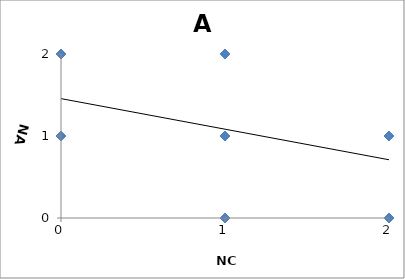
| Category | A |
|---|---|
| 2.0 | 0 |
| 1.0 | 0 |
| 1.0 | 1 |
| 2.0 | 1 |
| 2.0 | 1 |
| 1.0 | 2 |
| 2.0 | 1 |
| 1.0 | 1 |
| 1.0 | 1 |
| 2.0 | 1 |
| 2.0 | 0 |
| 2.0 | 1 |
| 2.0 | 1 |
| 0.0 | 2 |
| 1.0 | 2 |
| 1.0 | 1 |
| 2.0 | 1 |
| 2.0 | 0 |
| 0.0 | 2 |
| 2.0 | 0 |
| 1.0 | 0 |
| 1.0 | 0 |
| 2.0 | 1 |
| 2.0 | 0 |
| 2.0 | 1 |
| 2.0 | 1 |
| 2.0 | 1 |
| 2.0 | 1 |
| 2.0 | 1 |
| 1.0 | 1 |
| 1.0 | 1 |
| 2.0 | 1 |
| 2.0 | 1 |
| 2.0 | 1 |
| 2.0 | 1 |
| 1.0 | 1 |
| 2.0 | 1 |
| 1.0 | 1 |
| 2.0 | 1 |
| 1.0 | 2 |
| 2.0 | 1 |
| 1.0 | 2 |
| 1.0 | 0 |
| 0.0 | 2 |
| 1.0 | 1 |
| 2.0 | 1 |
| 2.0 | 0 |
| 2.0 | 1 |
| 1.0 | 2 |
| 2.0 | 1 |
| 0.0 | 2 |
| 1.0 | 1 |
| 2.0 | 1 |
| 2.0 | 1 |
| 2.0 | 0 |
| 1.0 | 0 |
| 1.0 | 0 |
| 1.0 | 1 |
| 2.0 | 0 |
| 2.0 | 1 |
| 1.0 | 2 |
| 2.0 | 0 |
| 1.0 | 1 |
| 1.0 | 1 |
| 1.0 | 2 |
| 2.0 | 0 |
| 1.0 | 1 |
| 2.0 | 1 |
| 1.0 | 1 |
| 1.0 | 1 |
| 2.0 | 1 |
| 2.0 | 1 |
| 2.0 | 1 |
| 2.0 | 1 |
| 2.0 | 1 |
| 1.0 | 1 |
| 1.0 | 0 |
| 0.0 | 2 |
| 1.0 | 1 |
| 2.0 | 1 |
| 1.0 | 1 |
| 1.0 | 1 |
| 2.0 | 1 |
| 1.0 | 0 |
| 2.0 | 0 |
| 2.0 | 1 |
| 2.0 | 0 |
| 1.0 | 1 |
| 1.0 | 1 |
| 0.0 | 2 |
| 1.0 | 1 |
| 2.0 | 1 |
| 1.0 | 0 |
| 1.0 | 1 |
| 2.0 | 1 |
| 2.0 | 1 |
| 2.0 | 1 |
| 2.0 | 1 |
| 0.0 | 1 |
| 1.0 | 1 |
| 1.0 | 1 |
| 0.0 | 2 |
| 0.0 | 1 |
| 2.0 | 0 |
| 2.0 | 1 |
| 2.0 | 0 |
| 1.0 | 2 |
| 1.0 | 1 |
| 2.0 | 1 |
| 0.0 | 2 |
| 0.0 | 2 |
| 2.0 | 0 |
| 1.0 | 1 |
| 1.0 | 1 |
| 2.0 | 1 |
| 2.0 | 0 |
| 1.0 | 1 |
| 1.0 | 1 |
| 1.0 | 1 |
| 0.0 | 2 |
| 2.0 | 1 |
| 1.0 | 1 |
| 2.0 | 0 |
| 1.0 | 1 |
| 1.0 | 2 |
| 2.0 | 1 |
| 0.0 | 2 |
| 2.0 | 0 |
| 1.0 | 1 |
| 2.0 | 0 |
| 2.0 | 1 |
| 1.0 | 1 |
| 1.0 | 1 |
| 1.0 | 1 |
| 2.0 | 1 |
| 1.0 | 1 |
| 2.0 | 1 |
| 2.0 | 1 |
| 2.0 | 1 |
| 2.0 | 0 |
| 1.0 | 1 |
| 2.0 | 1 |
| 0.0 | 1 |
| 1.0 | 1 |
| 0.0 | 2 |
| 2.0 | 1 |
| 1.0 | 1 |
| 2.0 | 1 |
| 0.0 | 2 |
| 2.0 | 1 |
| 2.0 | 1 |
| 2.0 | 1 |
| 1.0 | 1 |
| 1.0 | 1 |
| 1.0 | 2 |
| 2.0 | 1 |
| 0.0 | 2 |
| 1.0 | 1 |
| 2.0 | 1 |
| 2.0 | 0 |
| 2.0 | 0 |
| 2.0 | 0 |
| 2.0 | 0 |
| 2.0 | 0 |
| 1.0 | 2 |
| 1.0 | 1 |
| 1.0 | 2 |
| 2.0 | 1 |
| 2.0 | 0 |
| 1.0 | 1 |
| 2.0 | 1 |
| 1.0 | 1 |
| 1.0 | 1 |
| 1.0 | 2 |
| 0.0 | 2 |
| 2.0 | 1 |
| 2.0 | 0 |
| 1.0 | 1 |
| 1.0 | 2 |
| 1.0 | 0 |
| 2.0 | 1 |
| 2.0 | 1 |
| 1.0 | 1 |
| 1.0 | 1 |
| 1.0 | 0 |
| 1.0 | 2 |
| 2.0 | 1 |
| 1.0 | 2 |
| 1.0 | 0 |
| 0.0 | 1 |
| 1.0 | 1 |
| 2.0 | 1 |
| 1.0 | 1 |
| 1.0 | 1 |
| 2.0 | 1 |
| 2.0 | 1 |
| 0.0 | 1 |
| 1.0 | 1 |
| 2.0 | 1 |
| 1.0 | 1 |
| 2.0 | 1 |
| 2.0 | 1 |
| 1.0 | 1 |
| 1.0 | 2 |
| 2.0 | 0 |
| 1.0 | 1 |
| 2.0 | 1 |
| 1.0 | 1 |
| 1.0 | 2 |
| 2.0 | 0 |
| 1.0 | 2 |
| 2.0 | 1 |
| 1.0 | 2 |
| 2.0 | 1 |
| 2.0 | 0 |
| 1.0 | 1 |
| 0.0 | 1 |
| 1.0 | 1 |
| 2.0 | 1 |
| 1.0 | 1 |
| 1.0 | 2 |
| 1.0 | 1 |
| 2.0 | 0 |
| 2.0 | 1 |
| 2.0 | 1 |
| 1.0 | 1 |
| 2.0 | 1 |
| 2.0 | 1 |
| 1.0 | 2 |
| 1.0 | 1 |
| 2.0 | 1 |
| 2.0 | 0 |
| 0.0 | 2 |
| 1.0 | 2 |
| 1.0 | 1 |
| 2.0 | 1 |
| 2.0 | 1 |
| 1.0 | 1 |
| 2.0 | 0 |
| 1.0 | 0 |
| 2.0 | 0 |
| 1.0 | 1 |
| 1.0 | 1 |
| 2.0 | 0 |
| 1.0 | 1 |
| 2.0 | 1 |
| 1.0 | 1 |
| 2.0 | 1 |
| 1.0 | 1 |
| 2.0 | 1 |
| 1.0 | 1 |
| 2.0 | 1 |
| 0.0 | 2 |
| 2.0 | 1 |
| 1.0 | 2 |
| 1.0 | 1 |
| 2.0 | 1 |
| 2.0 | 1 |
| 1.0 | 1 |
| 1.0 | 1 |
| 2.0 | 0 |
| 2.0 | 1 |
| 0.0 | 1 |
| 2.0 | 1 |
| 1.0 | 1 |
| 1.0 | 1 |
| 2.0 | 1 |
| 2.0 | 1 |
| 2.0 | 1 |
| 1.0 | 1 |
| 0.0 | 2 |
| 1.0 | 1 |
| 2.0 | 1 |
| 2.0 | 1 |
| 2.0 | 1 |
| 2.0 | 1 |
| 2.0 | 1 |
| 1.0 | 1 |
| 2.0 | 1 |
| 2.0 | 1 |
| 2.0 | 1 |
| 1.0 | 1 |
| 2.0 | 1 |
| 1.0 | 1 |
| 2.0 | 1 |
| 0.0 | 1 |
| 1.0 | 2 |
| 2.0 | 1 |
| 1.0 | 1 |
| 1.0 | 1 |
| 1.0 | 1 |
| 1.0 | 1 |
| 1.0 | 1 |
| 0.0 | 2 |
| 1.0 | 1 |
| 1.0 | 1 |
| 2.0 | 1 |
| 1.0 | 0 |
| 2.0 | 1 |
| 1.0 | 1 |
| 2.0 | 1 |
| 1.0 | 1 |
| 2.0 | 0 |
| 1.0 | 1 |
| 2.0 | 0 |
| 1.0 | 1 |
| 1.0 | 1 |
| 1.0 | 1 |
| 1.0 | 1 |
| 1.0 | 2 |
| 1.0 | 0 |
| 2.0 | 1 |
| 2.0 | 1 |
| 2.0 | 1 |
| 1.0 | 0 |
| 1.0 | 1 |
| 1.0 | 1 |
| 1.0 | 0 |
| 1.0 | 0 |
| 2.0 | 1 |
| 1.0 | 0 |
| 2.0 | 0 |
| 1.0 | 0 |
| 1.0 | 1 |
| 2.0 | 0 |
| 1.0 | 1 |
| 2.0 | 1 |
| 1.0 | 1 |
| 2.0 | 1 |
| 1.0 | 0 |
| 2.0 | 0 |
| 2.0 | 1 |
| 2.0 | 1 |
| 1.0 | 1 |
| 2.0 | 0 |
| 1.0 | 1 |
| 0.0 | 2 |
| 1.0 | 0 |
| 1.0 | 2 |
| 1.0 | 1 |
| 1.0 | 1 |
| 2.0 | 1 |
| 1.0 | 1 |
| 1.0 | 1 |
| 1.0 | 1 |
| 2.0 | 1 |
| 1.0 | 2 |
| 1.0 | 0 |
| 1.0 | 1 |
| 2.0 | 1 |
| 1.0 | 1 |
| 2.0 | 1 |
| 2.0 | 1 |
| 1.0 | 1 |
| 1.0 | 1 |
| 1.0 | 2 |
| 2.0 | 1 |
| 2.0 | 1 |
| 2.0 | 1 |
| 1.0 | 2 |
| 2.0 | 0 |
| 2.0 | 1 |
| 2.0 | 0 |
| 2.0 | 1 |
| 0.0 | 2 |
| 2.0 | 1 |
| 2.0 | 1 |
| 1.0 | 2 |
| 2.0 | 1 |
| 2.0 | 1 |
| 0.0 | 1 |
| 2.0 | 1 |
| 1.0 | 0 |
| 1.0 | 1 |
| 1.0 | 1 |
| 1.0 | 1 |
| 2.0 | 1 |
| 2.0 | 0 |
| 2.0 | 0 |
| 2.0 | 1 |
| 2.0 | 1 |
| 2.0 | 1 |
| 2.0 | 1 |
| 1.0 | 0 |
| 1.0 | 2 |
| 1.0 | 1 |
| 0.0 | 1 |
| 1.0 | 1 |
| 1.0 | 0 |
| 1.0 | 1 |
| 0.0 | 2 |
| 2.0 | 0 |
| 1.0 | 1 |
| 2.0 | 1 |
| 2.0 | 1 |
| 2.0 | 1 |
| 1.0 | 0 |
| 1.0 | 1 |
| 2.0 | 1 |
| 2.0 | 1 |
| 1.0 | 1 |
| 2.0 | 1 |
| 2.0 | 1 |
| 2.0 | 1 |
| 1.0 | 0 |
| 1.0 | 1 |
| 2.0 | 1 |
| 2.0 | 1 |
| 1.0 | 2 |
| 1.0 | 1 |
| 2.0 | 1 |
| 0.0 | 1 |
| 0.0 | 2 |
| 0.0 | 2 |
| 2.0 | 1 |
| 2.0 | 0 |
| 2.0 | 1 |
| 1.0 | 1 |
| 2.0 | 1 |
| 0.0 | 2 |
| 1.0 | 1 |
| 2.0 | 1 |
| 1.0 | 0 |
| 1.0 | 0 |
| 2.0 | 0 |
| 1.0 | 0 |
| 2.0 | 0 |
| 1.0 | 1 |
| 2.0 | 1 |
| 1.0 | 0 |
| 1.0 | 0 |
| 0.0 | 1 |
| 2.0 | 1 |
| 2.0 | 0 |
| 1.0 | 1 |
| 2.0 | 1 |
| 2.0 | 1 |
| 2.0 | 1 |
| 1.0 | 2 |
| 1.0 | 1 |
| 2.0 | 1 |
| 1.0 | 0 |
| 2.0 | 0 |
| 2.0 | 0 |
| 1.0 | 2 |
| 1.0 | 1 |
| 1.0 | 1 |
| 2.0 | 1 |
| 2.0 | 0 |
| 2.0 | 1 |
| 2.0 | 0 |
| 0.0 | 1 |
| 1.0 | 1 |
| 2.0 | 0 |
| 2.0 | 1 |
| 1.0 | 1 |
| 1.0 | 2 |
| 2.0 | 1 |
| 1.0 | 1 |
| 1.0 | 2 |
| 2.0 | 1 |
| 0.0 | 2 |
| 2.0 | 1 |
| 2.0 | 1 |
| 1.0 | 1 |
| 0.0 | 2 |
| 2.0 | 1 |
| 2.0 | 1 |
| 1.0 | 1 |
| 2.0 | 0 |
| 0.0 | 2 |
| 1.0 | 1 |
| 1.0 | 1 |
| 1.0 | 1 |
| 1.0 | 1 |
| 1.0 | 1 |
| 2.0 | 1 |
| 1.0 | 1 |
| 2.0 | 1 |
| 1.0 | 2 |
| 0.0 | 2 |
| 2.0 | 1 |
| 1.0 | 2 |
| 0.0 | 2 |
| 2.0 | 1 |
| 2.0 | 0 |
| 1.0 | 1 |
| 1.0 | 1 |
| 1.0 | 2 |
| 2.0 | 1 |
| 1.0 | 1 |
| 2.0 | 0 |
| 1.0 | 1 |
| 1.0 | 1 |
| 2.0 | 0 |
| 2.0 | 1 |
| 1.0 | 1 |
| 2.0 | 1 |
| 1.0 | 1 |
| 1.0 | 1 |
| 2.0 | 1 |
| 2.0 | 0 |
| 1.0 | 0 |
| 2.0 | 1 |
| 2.0 | 0 |
| 2.0 | 1 |
| 1.0 | 1 |
| 2.0 | 1 |
| 1.0 | 0 |
| 0.0 | 1 |
| 2.0 | 1 |
| 2.0 | 1 |
| 2.0 | 0 |
| 1.0 | 1 |
| 2.0 | 1 |
| 1.0 | 0 |
| 1.0 | 1 |
| 1.0 | 1 |
| 2.0 | 1 |
| 2.0 | 1 |
| 2.0 | 1 |
| 1.0 | 1 |
| 1.0 | 2 |
| 0.0 | 2 |
| 1.0 | 1 |
| 1.0 | 0 |
| 1.0 | 2 |
| 2.0 | 1 |
| 1.0 | 1 |
| 2.0 | 1 |
| 2.0 | 1 |
| 2.0 | 0 |
| 0.0 | 2 |
| 2.0 | 0 |
| 2.0 | 1 |
| 2.0 | 1 |
| 2.0 | 1 |
| 1.0 | 0 |
| 0.0 | 2 |
| 2.0 | 1 |
| 1.0 | 1 |
| 2.0 | 0 |
| 2.0 | 1 |
| 1.0 | 2 |
| 0.0 | 2 |
| 1.0 | 2 |
| 2.0 | 1 |
| 1.0 | 0 |
| 0.0 | 2 |
| 2.0 | 1 |
| 2.0 | 1 |
| 2.0 | 1 |
| 1.0 | 0 |
| 2.0 | 0 |
| 1.0 | 1 |
| 2.0 | 1 |
| 1.0 | 0 |
| 1.0 | 1 |
| 2.0 | 1 |
| 0.0 | 1 |
| 2.0 | 0 |
| 2.0 | 1 |
| 2.0 | 1 |
| 1.0 | 1 |
| 1.0 | 1 |
| 1.0 | 0 |
| 2.0 | 1 |
| 2.0 | 1 |
| 0.0 | 1 |
| 1.0 | 0 |
| 1.0 | 2 |
| 2.0 | 1 |
| 1.0 | 2 |
| 2.0 | 1 |
| 1.0 | 1 |
| 0.0 | 2 |
| 1.0 | 1 |
| 1.0 | 1 |
| 1.0 | 1 |
| 1.0 | 2 |
| 2.0 | 0 |
| 1.0 | 2 |
| 0.0 | 2 |
| 1.0 | 1 |
| 2.0 | 1 |
| 0.0 | 2 |
| 1.0 | 1 |
| 1.0 | 1 |
| 1.0 | 0 |
| 2.0 | 1 |
| 0.0 | 2 |
| 2.0 | 0 |
| 1.0 | 1 |
| 0.0 | 2 |
| 2.0 | 1 |
| 2.0 | 1 |
| 2.0 | 1 |
| 1.0 | 1 |
| 2.0 | 0 |
| 1.0 | 1 |
| 1.0 | 2 |
| 1.0 | 0 |
| 2.0 | 0 |
| 2.0 | 0 |
| 2.0 | 0 |
| 2.0 | 1 |
| 1.0 | 0 |
| 1.0 | 2 |
| 1.0 | 0 |
| 2.0 | 0 |
| 1.0 | 0 |
| 2.0 | 1 |
| 2.0 | 1 |
| 2.0 | 1 |
| 1.0 | 1 |
| 1.0 | 0 |
| 2.0 | 1 |
| 2.0 | 1 |
| 0.0 | 1 |
| 2.0 | 1 |
| 2.0 | 1 |
| 2.0 | 1 |
| 1.0 | 2 |
| 2.0 | 1 |
| 1.0 | 1 |
| 0.0 | 2 |
| 1.0 | 2 |
| 2.0 | 0 |
| 2.0 | 1 |
| 2.0 | 1 |
| 1.0 | 1 |
| 1.0 | 1 |
| 1.0 | 0 |
| 2.0 | 1 |
| 1.0 | 1 |
| 2.0 | 0 |
| 2.0 | 1 |
| 1.0 | 1 |
| 2.0 | 0 |
| 2.0 | 0 |
| 1.0 | 1 |
| 2.0 | 1 |
| 1.0 | 1 |
| 1.0 | 0 |
| 2.0 | 1 |
| 2.0 | 0 |
| 1.0 | 1 |
| 0.0 | 1 |
| 0.0 | 2 |
| 1.0 | 1 |
| 1.0 | 1 |
| 1.0 | 1 |
| 0.0 | 1 |
| 2.0 | 0 |
| 2.0 | 1 |
| 1.0 | 1 |
| 2.0 | 1 |
| 1.0 | 1 |
| 0.0 | 1 |
| 1.0 | 1 |
| 2.0 | 0 |
| 2.0 | 1 |
| 1.0 | 1 |
| 2.0 | 1 |
| 2.0 | 1 |
| 2.0 | 1 |
| 2.0 | 0 |
| 2.0 | 1 |
| 1.0 | 1 |
| 1.0 | 1 |
| 1.0 | 1 |
| 1.0 | 0 |
| 2.0 | 1 |
| 1.0 | 2 |
| 2.0 | 1 |
| 2.0 | 1 |
| 2.0 | 1 |
| 1.0 | 0 |
| 2.0 | 0 |
| 2.0 | 1 |
| 2.0 | 0 |
| 2.0 | 1 |
| 2.0 | 1 |
| 1.0 | 2 |
| 2.0 | 1 |
| 2.0 | 1 |
| 1.0 | 1 |
| 2.0 | 1 |
| 1.0 | 1 |
| 2.0 | 1 |
| 2.0 | 0 |
| 1.0 | 1 |
| 2.0 | 0 |
| 0.0 | 1 |
| 1.0 | 0 |
| 2.0 | 1 |
| 2.0 | 1 |
| 2.0 | 1 |
| 2.0 | 1 |
| 1.0 | 1 |
| 2.0 | 1 |
| 2.0 | 1 |
| 1.0 | 1 |
| 1.0 | 1 |
| 1.0 | 1 |
| 1.0 | 1 |
| 2.0 | 1 |
| 1.0 | 1 |
| 1.0 | 1 |
| 1.0 | 0 |
| 2.0 | 1 |
| 2.0 | 1 |
| 1.0 | 1 |
| 1.0 | 1 |
| 2.0 | 0 |
| 2.0 | 1 |
| 1.0 | 1 |
| 1.0 | 1 |
| 1.0 | 1 |
| 0.0 | 2 |
| 2.0 | 1 |
| 1.0 | 2 |
| 2.0 | 1 |
| 1.0 | 1 |
| 2.0 | 1 |
| 1.0 | 0 |
| 2.0 | 1 |
| 2.0 | 1 |
| 0.0 | 1 |
| 2.0 | 1 |
| 2.0 | 1 |
| 2.0 | 0 |
| 2.0 | 0 |
| 2.0 | 1 |
| 2.0 | 1 |
| 1.0 | 1 |
| 2.0 | 1 |
| 1.0 | 1 |
| 2.0 | 1 |
| 2.0 | 1 |
| 1.0 | 1 |
| 1.0 | 2 |
| 1.0 | 1 |
| 1.0 | 0 |
| 2.0 | 0 |
| 2.0 | 1 |
| 1.0 | 1 |
| 2.0 | 1 |
| 2.0 | 1 |
| 1.0 | 0 |
| 1.0 | 2 |
| 1.0 | 1 |
| 2.0 | 0 |
| 2.0 | 1 |
| 1.0 | 1 |
| 0.0 | 2 |
| 2.0 | 0 |
| 2.0 | 1 |
| 2.0 | 1 |
| 2.0 | 1 |
| 1.0 | 2 |
| 2.0 | 0 |
| 1.0 | 1 |
| 1.0 | 1 |
| 2.0 | 1 |
| 2.0 | 1 |
| 2.0 | 0 |
| 1.0 | 2 |
| 1.0 | 1 |
| 2.0 | 1 |
| 2.0 | 1 |
| 2.0 | 0 |
| 2.0 | 0 |
| 2.0 | 1 |
| 1.0 | 1 |
| 2.0 | 0 |
| 2.0 | 1 |
| 1.0 | 2 |
| 1.0 | 1 |
| 1.0 | 1 |
| 0.0 | 2 |
| 1.0 | 1 |
| 0.0 | 2 |
| 2.0 | 1 |
| 2.0 | 1 |
| 2.0 | 0 |
| 1.0 | 2 |
| 2.0 | 1 |
| 1.0 | 0 |
| 1.0 | 1 |
| 1.0 | 0 |
| 0.0 | 2 |
| 2.0 | 1 |
| 1.0 | 1 |
| 2.0 | 1 |
| 2.0 | 0 |
| 2.0 | 1 |
| 2.0 | 1 |
| 2.0 | 1 |
| 2.0 | 0 |
| 1.0 | 2 |
| 1.0 | 0 |
| 1.0 | 1 |
| 1.0 | 2 |
| 2.0 | 0 |
| 1.0 | 1 |
| 1.0 | 1 |
| 1.0 | 1 |
| 1.0 | 1 |
| 1.0 | 1 |
| 2.0 | 1 |
| 1.0 | 2 |
| 0.0 | 2 |
| 0.0 | 1 |
| 2.0 | 1 |
| 2.0 | 1 |
| 2.0 | 1 |
| 2.0 | 1 |
| 2.0 | 1 |
| 1.0 | 0 |
| 2.0 | 0 |
| 2.0 | 1 |
| 2.0 | 1 |
| 2.0 | 0 |
| 1.0 | 2 |
| 1.0 | 2 |
| 1.0 | 0 |
| 1.0 | 0 |
| 1.0 | 1 |
| 1.0 | 1 |
| 2.0 | 1 |
| 1.0 | 2 |
| 2.0 | 0 |
| 2.0 | 1 |
| 2.0 | 1 |
| 2.0 | 1 |
| 1.0 | 2 |
| 1.0 | 2 |
| 2.0 | 1 |
| 1.0 | 1 |
| 1.0 | 1 |
| 2.0 | 0 |
| 1.0 | 0 |
| 1.0 | 2 |
| 2.0 | 1 |
| 1.0 | 1 |
| 2.0 | 1 |
| 1.0 | 1 |
| 1.0 | 2 |
| 2.0 | 1 |
| 2.0 | 1 |
| 2.0 | 1 |
| 2.0 | 1 |
| 1.0 | 0 |
| 2.0 | 1 |
| 1.0 | 1 |
| 2.0 | 1 |
| 2.0 | 1 |
| 2.0 | 1 |
| 2.0 | 0 |
| 2.0 | 1 |
| 2.0 | 1 |
| 1.0 | 0 |
| 1.0 | 1 |
| 1.0 | 2 |
| 1.0 | 1 |
| 1.0 | 1 |
| 2.0 | 1 |
| 1.0 | 0 |
| 2.0 | 1 |
| 1.0 | 0 |
| 1.0 | 2 |
| 2.0 | 1 |
| 1.0 | 2 |
| 2.0 | 1 |
| 2.0 | 1 |
| 2.0 | 1 |
| 2.0 | 1 |
| 1.0 | 1 |
| 1.0 | 1 |
| 1.0 | 1 |
| 2.0 | 1 |
| 2.0 | 1 |
| 1.0 | 0 |
| 2.0 | 1 |
| 1.0 | 1 |
| 1.0 | 1 |
| 1.0 | 1 |
| 2.0 | 1 |
| 2.0 | 1 |
| 1.0 | 1 |
| 2.0 | 1 |
| 2.0 | 1 |
| 0.0 | 2 |
| 0.0 | 1 |
| 2.0 | 0 |
| 2.0 | 1 |
| 2.0 | 0 |
| 2.0 | 1 |
| 2.0 | 0 |
| 1.0 | 0 |
| 1.0 | 2 |
| 2.0 | 1 |
| 0.0 | 2 |
| 2.0 | 1 |
| 1.0 | 1 |
| 2.0 | 1 |
| 1.0 | 0 |
| 2.0 | 1 |
| 1.0 | 2 |
| 2.0 | 1 |
| 0.0 | 2 |
| 2.0 | 1 |
| 1.0 | 0 |
| 1.0 | 1 |
| 1.0 | 1 |
| 2.0 | 0 |
| 1.0 | 1 |
| 2.0 | 0 |
| 1.0 | 0 |
| 1.0 | 2 |
| 0.0 | 1 |
| 0.0 | 2 |
| 0.0 | 1 |
| 2.0 | 1 |
| 2.0 | 1 |
| 1.0 | 1 |
| 2.0 | 1 |
| 1.0 | 1 |
| 1.0 | 1 |
| 2.0 | 1 |
| 1.0 | 1 |
| 0.0 | 2 |
| 1.0 | 2 |
| 2.0 | 1 |
| 1.0 | 1 |
| 2.0 | 0 |
| 2.0 | 0 |
| 2.0 | 1 |
| 2.0 | 1 |
| 1.0 | 1 |
| 0.0 | 1 |
| 1.0 | 1 |
| 2.0 | 0 |
| 2.0 | 0 |
| 1.0 | 2 |
| 2.0 | 1 |
| 2.0 | 0 |
| 1.0 | 1 |
| 0.0 | 1 |
| 2.0 | 1 |
| 2.0 | 1 |
| 1.0 | 1 |
| 1.0 | 1 |
| 2.0 | 1 |
| 1.0 | 1 |
| 2.0 | 1 |
| 2.0 | 1 |
| 1.0 | 0 |
| 1.0 | 0 |
| 1.0 | 1 |
| 1.0 | 1 |
| 1.0 | 1 |
| 2.0 | 0 |
| 0.0 | 2 |
| 2.0 | 0 |
| 2.0 | 1 |
| 2.0 | 1 |
| 2.0 | 0 |
| 2.0 | 1 |
| 1.0 | 1 |
| 2.0 | 0 |
| 1.0 | 1 |
| 2.0 | 1 |
| 2.0 | 1 |
| 2.0 | 1 |
| 2.0 | 0 |
| 1.0 | 2 |
| 1.0 | 0 |
| 1.0 | 1 |
| 1.0 | 1 |
| 1.0 | 1 |
| 1.0 | 0 |
| 2.0 | 1 |
| 1.0 | 1 |
| 2.0 | 1 |
| 2.0 | 1 |
| 2.0 | 1 |
| 2.0 | 1 |
| 2.0 | 1 |
| 1.0 | 1 |
| 2.0 | 0 |
| 1.0 | 2 |
| 2.0 | 1 |
| 1.0 | 2 |
| 1.0 | 1 |
| 2.0 | 1 |
| 1.0 | 1 |
| 2.0 | 1 |
| 1.0 | 1 |